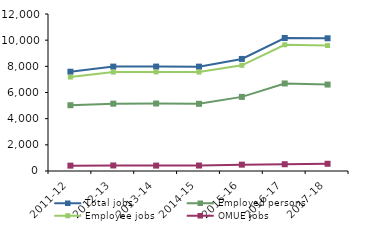
| Category | Total jobs | Employed persons | Employee jobs | OMUE jobs |
|---|---|---|---|---|
| 2011-12 | 7587 | 5027 | 7182 | 410 |
| 2012-13 | 7979 | 5146 | 7560 | 423 |
| 2013-14 | 7981 | 5159 | 7569 | 412 |
| 2014-15 | 7976 | 5135 | 7562 | 418 |
| 2015-16 | 8566 | 5664 | 8078 | 485 |
| 2016-17 | 10165 | 6691 | 9648 | 517 |
| 2017-18 | 10143 | 6608 | 9588 | 553 |